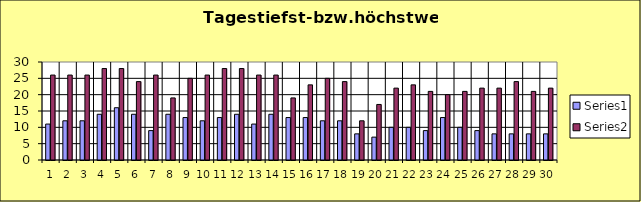
| Category | Series 0 | Series 1 |
|---|---|---|
| 0 | 11 | 26 |
| 1 | 12 | 26 |
| 2 | 12 | 26 |
| 3 | 14 | 28 |
| 4 | 16 | 28 |
| 5 | 14 | 24 |
| 6 | 9 | 26 |
| 7 | 14 | 19 |
| 8 | 13 | 25 |
| 9 | 12 | 26 |
| 10 | 13 | 28 |
| 11 | 14 | 28 |
| 12 | 11 | 26 |
| 13 | 14 | 26 |
| 14 | 13 | 19 |
| 15 | 13 | 23 |
| 16 | 12 | 25 |
| 17 | 12 | 24 |
| 18 | 8 | 12 |
| 19 | 7 | 17 |
| 20 | 10 | 22 |
| 21 | 10 | 23 |
| 22 | 9 | 21 |
| 23 | 13 | 20 |
| 24 | 10 | 21 |
| 25 | 9 | 22 |
| 26 | 8 | 22 |
| 27 | 8 | 24 |
| 28 | 8 | 21 |
| 29 | 8 | 22 |